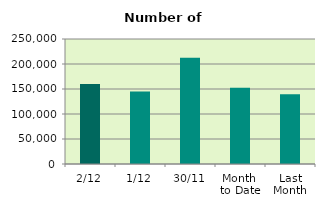
| Category | Series 0 |
|---|---|
| 2/12 | 159992 |
| 1/12 | 144916 |
| 30/11 | 212338 |
| Month 
to Date | 152454 |
| Last
Month | 139642.182 |